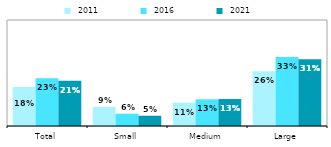
| Category |  2011 |  2016 |  2021 |
|---|---|---|---|
| Total | 0.184 | 0.225 | 0.214 |
| Small | 0.09 | 0.058 | 0.048 |
| Medium | 0.11 | 0.126 | 0.127 |
| Large | 0.258 | 0.326 | 0.315 |